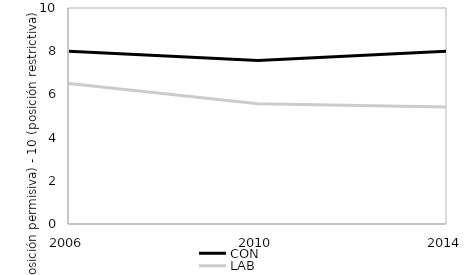
| Category | CON | LAB |
|---|---|---|
| 2006.0 | 8 | 6.5 |
| 2010.0 | 7.57 | 5.57 |
| 2014.0 | 8 | 5.42 |